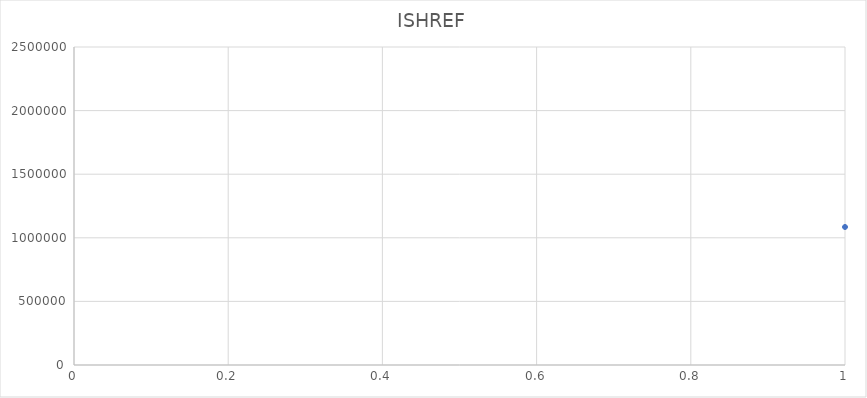
| Category | ISHREF |
|---|---|
| 0 | 1084992 |
| 1 | 1085006 |
| 2 | 1085018 |
| 3 | 1085031 |
| 4 | 1085043 |
| 5 | 1085055 |
| 6 | 1085067 |
| 7 | 1085079 |
| 8 | 1085080 |
| 9 | 1085092 |
| 10 | 1087479 |
| 11 | 1085111 |
| 12 | 1085123 |
| 13 | 1085135 |
| 14 | 1085147 |
| 15 | 1086882 |
| 16 | 1085159 |
| 17 | 1085160 |
| 18 | 1085172 |
| 19 | 1086894 |
| 20 | 1085184 |
| 21 | 1085196 |
| 22 | 1085203 |
| 23 | 1085215 |
| 24 | 1085227 |
| 25 | 1086901 |
| 26 | 1085239 |
| 27 | 1085240 |
| 28 | 1085252 |
| 29 | 1085264 |
| 30 | 1085276 |
| 31 | 1086913 |
| 32 | 1085288 |
| 33 | 1085307 |
| 34 | 1085319 |
| 35 | 1086925 |
| 36 | 1085320 |
| 37 | 1085332 |
| 38 | 1085344 |
| 39 | 1085356 |
| 40 | 1086937 |
| 41 | 1085368 |
| 42 | 1085381 |
| 43 | 1085393 |
| 44 | 1086949 |
| 45 | 1085400 |
| 46 | 1085412 |
| 47 | 1087117 |
| 48 | 1086950 |
| 49 | 1087129 |
| 50 | 1087130 |
| 51 | 1087142 |
| 52 | 1086962 |
| 53 | 1087154 |
| 54 | 1085424 |
| 55 | 1085436 |
| 56 | 1085448 |
| 57 | 1085461 |
| 58 | 1085473 |
| 59 | 1085485 |
| 60 | 1085497 |
| 61 | 1085504 |
| 62 | 1086974 |
| 63 | 1085516 |
| 64 | 1085528 |
| 65 | 1085541 |
| 66 | 1086986 |
| 67 | 1085553 |
| 68 | 1085565 |
| 69 | 1085577 |
| 70 | 1086998 |
| 71 | 1085589 |
| 72 | 1085590 |
| 73 | 1087001 |
| 74 | 1085608 |
| 75 | 1085621 |
| 76 | 1087013 |
| 77 | 1085633 |
| 78 | 1085645 |
| 79 | 1087025 |
| 80 | 1085657 |
| 81 | 1085669 |
| 82 | 1087037 |
| 83 | 1085670 |
| 84 | 1085682 |
| 85 | 1087049 |
| 86 | 1085694 |
| 87 | 1085701 |
| 88 | 1087166 |
| 89 | 1087178 |
| 90 | 1087191 |
| 91 | 1087209 |
| 92 | 1087050 |
| 93 | 1087210 |
| 94 | 1085713 |
| 95 | 1085725 |
| 96 | 1085737 |
| 97 | 1087062 |
| 98 | 1085749 |
| 99 | 1085750 |
| 100 | 1085762 |
| 101 | 1085774 |
| 102 | 1085786 |
| 103 | 1085798 |
| 104 | 1085805 |
| 105 | 1085817 |
| 106 | 1085829 |
| 107 | 1085830 |
| 108 | 1085842 |
| 109 | 1085854 |
| 110 | 1085866 |
| 111 | 1085878 |
| 112 | 1085891 |
| 113 | 1085909 |
| 114 | 1085910 |
| 115 | 1085922 |
| 116 | 1087222 |
| 117 | 1087234 |
| 118 | 1087246 |
| 119 | 1087258 |
| 120 | 1087271 |
| 121 | 1087283 |
| 122 | 1087295 |
| 123 | 1087302 |
| 124 | 1087314 |
| 125 | 1087326 |
| 126 | 1085934 |
| 127 | 1085946 |
| 128 | 1085958 |
| 129 | 1085971 |
| 130 | 1087074 |
| 131 | 1087338 |
| 132 | 1087351 |
| 133 | 1087086 |
| 134 | 1087363 |
| 135 | 1087375 |
| 136 | 1087387 |
| 137 | 1087399 |
| 138 | 1087406 |
| 139 | 1087098 |
| 140 | 1087418 |
| 141 | 1087431 |
| 142 | 1087443 |
| 143 | 1087455 |
| 144 | 1087467 |
| 145 | 1087105 |
| 146 | 1085983 |
| 147 | 1085995 |
| 148 | 1086009 |
| 149 | 1086010 |
| 150 | 1086022 |
| 151 | 1084771 |
| 152 | 1086034 |
| 153 | 1086046 |
| 154 | 1086058 |
| 155 | 1086071 |
| 156 | 1084783 |
| 157 | 1086083 |
| 158 | 1086095 |
| 159 | 1086102 |
| 160 | 1084795 |
| 161 | 1086114 |
| 162 | 1086126 |
| 163 | 1086138 |
| 164 | 1086151 |
| 165 | 1086163 |
| 166 | 1084802 |
| 167 | 1086175 |
| 168 | 1086187 |
| 169 | 1086199 |
| 170 | 1086206 |
| 171 | 1084814 |
| 172 | 1086218 |
| 173 | 1086231 |
| 174 | 1084826 |
| 175 | 1086243 |
| 176 | 1086255 |
| 177 | 1086267 |
| 178 | 1084838 |
| 179 | 1086279 |
| 180 | 1086280 |
| 181 | 1086292 |
| 182 | 1084851 |
| 183 | 1086311 |
| 184 | 1086323 |
| 185 | 1084863 |
| 186 | 1086335 |
| 187 | 1086347 |
| 188 | 1084875 |
| 189 | 1086359 |
| 190 | 1086360 |
| 191 | 1084887 |
| 192 | 1086372 |
| 193 | 1086384 |
| 194 | 1086396 |
| 195 | 1086403 |
| 196 | 1084899 |
| 197 | 1086415 |
| 198 | 1086427 |
| 199 | 1086439 |
| 200 | 1086440 |
| 201 | 1086452 |
| 202 | 1086464 |
| 203 | 1086476 |
| 204 | 1086488 |
| 205 | 1084906 |
| 206 | 1086507 |
| 207 | 1086519 |
| 208 | 1086520 |
| 209 | 1084918 |
| 210 | 1086532 |
| 211 | 1086544 |
| 212 | 1084931 |
| 213 | 1086556 |
| 214 | 1084943 |
| 215 | 1086568 |
| 216 | 1086581 |
| 217 | 1086593 |
| 218 | 1086600 |
| 219 | 1086612 |
| 220 | 1086624 |
| 221 | 1086636 |
| 222 | 1086648 |
| 223 | 1086661 |
| 224 | 1086673 |
| 225 | 1086685 |
| 226 | 1086697 |
| 227 | 1086704 |
| 228 | 1086716 |
| 229 | 1086728 |
| 230 | 1086741 |
| 231 | 1086753 |
| 232 | 1086765 |
| 233 | 1086777 |
| 234 | 1086789 |
| 235 | 1084955 |
| 236 | 1086790 |
| 237 | 1084967 |
| 238 | 1086808 |
| 239 | 1086821 |
| 240 | 1086833 |
| 241 | 1086845 |
| 242 | 1086857 |
| 243 | 1084979 |
| 244 | 1084980 |
| 245 | 1086869 |
| 246 | 1086870 |
| 247 | 911007 |
| 248 | 911019 |
| 249 | 910772 |
| 250 | 911020 |
| 251 | 911032 |
| 252 | 910784 |
| 253 | 911044 |
| 254 | 911056 |
| 255 | 911068 |
| 256 | 910796 |
| 257 | 911081 |
| 258 | 911093 |
| 259 | 910803 |
| 260 | 911100 |
| 261 | 911112 |
| 262 | 911124 |
| 263 | 911136 |
| 264 | 911148 |
| 265 | 910815 |
| 266 | 911161 |
| 267 | 911173 |
| 268 | 911185 |
| 269 | 911197 |
| 270 | 911204 |
| 271 | 911216 |
| 272 | 910827 |
| 273 | 911228 |
| 274 | 911241 |
| 275 | 911253 |
| 276 | 911265 |
| 277 | 911277 |
| 278 | 911289 |
| 279 | 910839 |
| 280 | 911290 |
| 281 | 911308 |
| 282 | 911321 |
| 283 | 911333 |
| 284 | 911345 |
| 285 | 911357 |
| 286 | 911369 |
| 287 | 911370 |
| 288 | 911382 |
| 289 | 911394 |
| 290 | 911401 |
| 291 | 911413 |
| 292 | 910840 |
| 293 | 911425 |
| 294 | 911437 |
| 295 | 910852 |
| 296 | 911449 |
| 297 | 911450 |
| 298 | 910864 |
| 299 | 911462 |
| 300 | 910876 |
| 301 | 911474 |
| 302 | 911486 |
| 303 | 910888 |
| 304 | 911498 |
| 305 | 911505 |
| 306 | 910907 |
| 307 | 911517 |
| 308 | 911529 |
| 309 | 911530 |
| 310 | 910919 |
| 311 | 911542 |
| 312 | 911554 |
| 313 | 911566 |
| 314 | 910920 |
| 315 | 911578 |
| 316 | 911591 |
| 317 | 911609 |
| 318 | 910932 |
| 319 | 911610 |
| 320 | 911622 |
| 321 | 911634 |
| 322 | 910944 |
| 323 | 911646 |
| 324 | 911658 |
| 325 | 910956 |
| 326 | 911671 |
| 327 | 910968 |
| 328 | 911683 |
| 329 | 910981 |
| 330 | 911695 |
| 331 | 911702 |
| 332 | 910993 |
| 333 | 911714 |
| 334 | 911726 |
| 335 | 911738 |
| 336 | 911751 |
| 337 | 911855 |
| 338 | 911867 |
| 339 | 911879 |
| 340 | 911763 |
| 341 | 911880 |
| 342 | 911892 |
| 343 | 911775 |
| 344 | 911911 |
| 345 | 911923 |
| 346 | 911935 |
| 347 | 911787 |
| 348 | 911947 |
| 349 | 911959 |
| 350 | 911799 |
| 351 | 911960 |
| 352 | 911972 |
| 353 | 911984 |
| 354 | 911806 |
| 355 | 911996 |
| 356 | 911818 |
| 357 | 912011 |
| 358 | 912023 |
| 359 | 911831 |
| 360 | 912035 |
| 361 | 912047 |
| 362 | 912059 |
| 363 | 912060 |
| 364 | 911843 |
| 365 | 912072 |
| 366 | 1047637 |
| 367 | 1047649 |
| 368 | 1047650 |
| 369 | 1047662 |
| 370 | 1047674 |
| 371 | 1047686 |
| 372 | 1047705 |
| 373 | 1047698 |
| 374 | 1047717 |
| 375 | 1047729 |
| 376 | 1047730 |
| 377 | 1047742 |
| 378 | 1047754 |
| 379 | 1047766 |
| 380 | 1047533 |
| 381 | 1047545 |
| 382 | 1047557 |
| 383 | 1047569 |
| 384 | 1047570 |
| 385 | 1047778 |
| 386 | 1047791 |
| 387 | 1047809 |
| 388 | 1047810 |
| 389 | 1047582 |
| 390 | 1047594 |
| 391 | 1047601 |
| 392 | 1047613 |
| 393 | 1047822 |
| 394 | 1047834 |
| 395 | 1047846 |
| 396 | 1047858 |
| 397 | 1047871 |
| 398 | 1047883 |
| 399 | 1047895 |
| 400 | 1047625 |
| 401 | 1047902 |
| 402 | 1047914 |
| 403 | 1047926 |
| 404 | 1047938 |
| 405 | 1047951 |
| 406 | 1047963 |
| 407 | 1047975 |
| 408 | 1047987 |
| 409 | 1047999 |
| 410 | 1048002 |
| 411 | 1048014 |
| 412 | 1048026 |
| 413 | 1048038 |
| 414 | 1048051 |
| 415 | 1048063 |
| 416 | 1048075 |
| 417 | 1048087 |
| 418 | 1048099 |
| 419 | 1048106 |
| 420 | 1048118 |
| 421 | 1048131 |
| 422 | 1048143 |
| 423 | 1048155 |
| 424 | 1048167 |
| 425 | 1048179 |
| 426 | 1048180 |
| 427 | 1048192 |
| 428 | 1048211 |
| 429 | 1048223 |
| 430 | 1048235 |
| 431 | 1048247 |
| 432 | 1048259 |
| 433 | 1048260 |
| 434 | 1048272 |
| 435 | 1048284 |
| 436 | 1048296 |
| 437 | 1048303 |
| 438 | 1048315 |
| 439 | 1048327 |
| 440 | 1048339 |
| 441 | 1048340 |
| 442 | 1048352 |
| 443 | 1048364 |
| 444 | 1087627 |
| 445 | 1087639 |
| 446 | 1087480 |
| 447 | 1087640 |
| 448 | 1087652 |
| 449 | 1087664 |
| 450 | 1087676 |
| 451 | 1088157 |
| 452 | 1087688 |
| 453 | 1087492 |
| 454 | 1087707 |
| 455 | 1087511 |
| 456 | 1087719 |
| 457 | 1087720 |
| 458 | 1087732 |
| 459 | 1087523 |
| 460 | 1087744 |
| 461 | 1087756 |
| 462 | 1087535 |
| 463 | 1087768 |
| 464 | 1087781 |
| 465 | 1087793 |
| 466 | 1087547 |
| 467 | 1087800 |
| 468 | 1087812 |
| 469 | 1087559 |
| 470 | 1087824 |
| 471 | 1087836 |
| 472 | 1872489 |
| 473 | 2116698 |
| 474 | 2125905 |
| 475 | 2135242 |
| 476 | 2135715 |
| 477 | 1133262 |
| 478 | 1087848 |
| 479 | 1872570 |
| 480 | 2116822 |
| 481 | 2126030 |
| 482 | 2135383 |
| 483 | 2135740 |
| 484 | 1133410 |
| 485 | 1087861 |
| 486 | 1087560 |
| 487 | 1087873 |
| 488 | 1087885 |
| 489 | 1087572 |
| 490 | 1087897 |
| 491 | 1087904 |
| 492 | 1087916 |
| 493 | 1087928 |
| 494 | 1087584 |
| 495 | 1087941 |
| 496 | 1087953 |
| 497 | 1088090 |
| 498 | 1087965 |
| 499 | 1087977 |
| 500 | 1087989 |
| 501 | 1087596 |
| 502 | 1087990 |
| 503 | 1088004 |
| 504 | 1088016 |
| 505 | 1088028 |
| 506 | 1088133 |
| 507 | 1088121 |
| 508 | 1088145 |
| 509 | 1087603 |
| 510 | 1088041 |
| 511 | 1088053 |
| 512 | 1088065 |
| 513 | 1087615 |
| 514 | 1088077 |
| 515 | 1114669 |
| 516 | 1114670 |
| 517 | 1114682 |
| 518 | 1114701 |
| 519 | 1114694 |
| 520 | 1114713 |
| 521 | 1114725 |
| 522 | 1114737 |
| 523 | 1114749 |
| 524 | 1114750 |
| 525 | 1114762 |
| 526 | 1114774 |
| 527 | 1114786 |
| 528 | 1114798 |
| 529 | 1114805 |
| 530 | 1114817 |
| 531 | 1114829 |
| 532 | 1114830 |
| 533 | 1114842 |
| 534 | 1114854 |
| 535 | 1114866 |
| 536 | 1114878 |
| 537 | 1114891 |
| 538 | 1114909 |
| 539 | 1114910 |
| 540 | 1114922 |
| 541 | 1114934 |
| 542 | 1114946 |
| 543 | 1114958 |
| 544 | 1114971 |
| 545 | 1114983 |
| 546 | 1114995 |
| 547 | 1115009 |
| 548 | 1115010 |
| 549 | 1115022 |
| 550 | 1115034 |
| 551 | 1115046 |
| 552 | 1115058 |
| 553 | 1115071 |
| 554 | 1115083 |
| 555 | 1115095 |
| 556 | 1115102 |
| 557 | 1115114 |
| 558 | 1115126 |
| 559 | 1115138 |
| 560 | 1115151 |
| 561 | 1115163 |
| 562 | 1115175 |
| 563 | 1115187 |
| 564 | 1115199 |
| 565 | 1115206 |
| 566 | 1115218 |
| 567 | 1115231 |
| 568 | 1115243 |
| 569 | 1115255 |
| 570 | 1115267 |
| 571 | 1115279 |
| 572 | 1115280 |
| 573 | 1115292 |
| 574 | 1115311 |
| 575 | 1115323 |
| 576 | 1115335 |
| 577 | 1115347 |
| 578 | 1115359 |
| 579 | 1115360 |
| 580 | 1115372 |
| 581 | 1178023 |
| 582 | 1178035 |
| 583 | 1178047 |
| 584 | 1178059 |
| 585 | 1178060 |
| 586 | 1178072 |
| 587 | 1178084 |
| 588 | 1178096 |
| 589 | 1178103 |
| 590 | 1178115 |
| 591 | 1178127 |
| 592 | 1178139 |
| 593 | 1178140 |
| 594 | 1178152 |
| 595 | 1178164 |
| 596 | 1178176 |
| 597 | 1178188 |
| 598 | 1178207 |
| 599 | 1178219 |
| 600 | 1178220 |
| 601 | 1178232 |
| 602 | 1178244 |
| 603 | 1178256 |
| 604 | 1178268 |
| 605 | 1178281 |
| 606 | 1178293 |
| 607 | 1178300 |
| 608 | 1178312 |
| 609 | 1178324 |
| 610 | 1178336 |
| 611 | 1178348 |
| 612 | 1178361 |
| 613 | 1178373 |
| 614 | 1178385 |
| 615 | 1178397 |
| 616 | 1178404 |
| 617 | 1178416 |
| 618 | 1178428 |
| 619 | 1178441 |
| 620 | 1178453 |
| 621 | 1178465 |
| 622 | 1178477 |
| 623 | 1178489 |
| 624 | 1178490 |
| 625 | 1178508 |
| 626 | 1178521 |
| 627 | 1178533 |
| 628 | 1178545 |
| 629 | 1178557 |
| 630 | 1178569 |
| 631 | 1178570 |
| 632 | 1178582 |
| 633 | 1178594 |
| 634 | 1178601 |
| 635 | 1178613 |
| 636 | 1178625 |
| 637 | 1178637 |
| 638 | 1178649 |
| 639 | 1178650 |
| 640 | 1178662 |
| 641 | 1178674 |
| 642 | 1178686 |
| 643 | 1178698 |
| 644 | 1178705 |
| 645 | 1178717 |
| 646 | 1643342 |
| 647 | 1643354 |
| 648 | 1643366 |
| 649 | 1643839 |
| 650 | 1643378 |
| 651 | 1643391 |
| 652 | 1643840 |
| 653 | 1643409 |
| 654 | 1643410 |
| 655 | 1643852 |
| 656 | 1643422 |
| 657 | 1643434 |
| 658 | 1643446 |
| 659 | 1643458 |
| 660 | 1643864 |
| 661 | 1643471 |
| 662 | 1643483 |
| 663 | 1643876 |
| 664 | 1643495 |
| 665 | 1643502 |
| 666 | 1643514 |
| 667 | 1643888 |
| 668 | 1643526 |
| 669 | 1643538 |
| 670 | 1643551 |
| 671 | 1643907 |
| 672 | 1643563 |
| 673 | 1643575 |
| 674 | 1643919 |
| 675 | 1643587 |
| 676 | 1643599 |
| 677 | 1643920 |
| 678 | 1643606 |
| 679 | 1643618 |
| 680 | 1643631 |
| 681 | 1643932 |
| 682 | 1643643 |
| 683 | 1643655 |
| 684 | 1643667 |
| 685 | 1643679 |
| 686 | 1643944 |
| 687 | 1643680 |
| 688 | 1643692 |
| 689 | 1643956 |
| 690 | 1643711 |
| 691 | 1643723 |
| 692 | 1643968 |
| 693 | 1643735 |
| 694 | 1643747 |
| 695 | 1643981 |
| 696 | 1643759 |
| 697 | 1643993 |
| 698 | 1643760 |
| 699 | 1643772 |
| 700 | 1643784 |
| 701 | 1644007 |
| 702 | 1643796 |
| 703 | 2121639 |
| 704 | 2120199 |
| 705 | 2118029 |
| 706 | 2137709 |
| 707 | 2127186 |
| 708 | 1644019 |
| 709 | 1643803 |
| 710 | 1643815 |
| 711 | 1643827 |
| 712 | 1644204 |
| 713 | 1644216 |
| 714 | 1644683 |
| 715 | 1644228 |
| 716 | 1644241 |
| 717 | 1644253 |
| 718 | 1644020 |
| 719 | 1644265 |
| 720 | 1644032 |
| 721 | 1644277 |
| 722 | 1644289 |
| 723 | 1644290 |
| 724 | 1644044 |
| 725 | 1644308 |
| 726 | 1644321 |
| 727 | 1644056 |
| 728 | 1644333 |
| 729 | 1644345 |
| 730 | 1644357 |
| 731 | 1644068 |
| 732 | 1644369 |
| 733 | 1644370 |
| 734 | 1644382 |
| 735 | 1644081 |
| 736 | 1644394 |
| 737 | 1644401 |
| 738 | 1644093 |
| 739 | 1644413 |
| 740 | 1644425 |
| 741 | 1644100 |
| 742 | 1644437 |
| 743 | 1644449 |
| 744 | 1644112 |
| 745 | 1644450 |
| 746 | 1644462 |
| 747 | 1644124 |
| 748 | 1644474 |
| 749 | 1644486 |
| 750 | 1644136 |
| 751 | 1644498 |
| 752 | 1644505 |
| 753 | 1644148 |
| 754 | 1644517 |
| 755 | 1644529 |
| 756 | 1644530 |
| 757 | 1644161 |
| 758 | 1644542 |
| 759 | 1644554 |
| 760 | 1644173 |
| 761 | 1644566 |
| 762 | 1644578 |
| 763 | 1644591 |
| 764 | 1644609 |
| 765 | 1644185 |
| 766 | 1644610 |
| 767 | 1644622 |
| 768 | 1644634 |
| 769 | 1644646 |
| 770 | 1644197 |
| 771 | 1644658 |
| 772 | 1644671 |
| 773 | 2073992 |
| 774 | 2074006 |
| 775 | 2074055 |
| 776 | 2074067 |
| 777 | 2074079 |
| 778 | 2074092 |
| 779 | 2074111 |
| 780 | 2074123 |
| 781 | 2074147 |
| 782 | 2074159 |
| 783 | 2074160 |
| 784 | 2074172 |
| 785 | 2074184 |
| 786 | 2074196 |
| 787 | 2074203 |
| 788 | 2074227 |
| 789 | 2074239 |
| 790 | 2074307 |
| 791 | 2074252 |
| 792 | 2074319 |
| 793 | 2074264 |
| 794 | 2074276 |
| 795 | 2074332 |
| 796 | 2074344 |
| 797 | 2074368 |
| 798 | 2074393 |
| 799 | 2074400 |
| 800 | 2074424 |
| 801 | 2074436 |
| 802 | 2074448 |
| 803 | 2074461 |
| 804 | 2074485 |
| 805 | 2074504 |
| 806 | 2074528 |
| 807 | 2074553 |
| 808 | 2074565 |
| 809 | 2074577 |
| 810 | 2074590 |
| 811 | 2074621 |
| 812 | 2074657 |